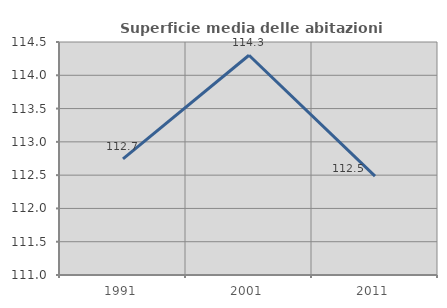
| Category | Superficie media delle abitazioni occupate |
|---|---|
| 1991.0 | 112.744 |
| 2001.0 | 114.301 |
| 2011.0 | 112.485 |